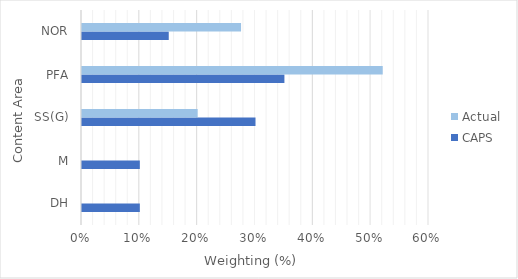
| Category | CAPS | Actual |
|---|---|---|
| DH | 0.1 | 0 |
| M | 0.1 | 0 |
| SS(G) | 0.3 | 0.2 |
| PFA | 0.35 | 0.52 |
| NOR | 0.15 | 0.275 |